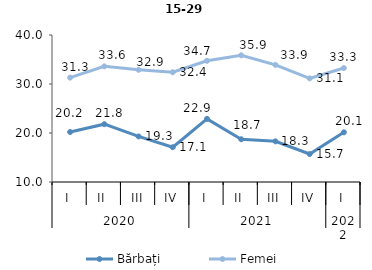
| Category | Bărbați | Femei |
|---|---|---|
| 0 | 20.2 | 31.3 |
| 1 | 21.8 | 33.6 |
| 2 | 19.3 | 32.9 |
| 3 | 17.1 | 32.4 |
| 4 | 22.886 | 34.731 |
| 5 | 18.722 | 35.856 |
| 6 | 18.3 | 33.9 |
| 7 | 15.71 | 31.142 |
| 8 | 20.142 | 33.259 |